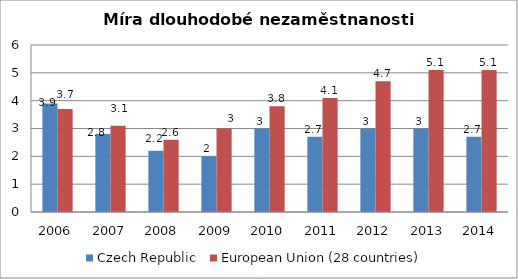
| Category | Czech Republic | European Union (28 countries) |
|---|---|---|
| 2006 | 3.9 | 3.7 |
| 2007 | 2.8 | 3.1 |
| 2008 | 2.2 | 2.6 |
| 2009 | 2 | 3 |
| 2010 | 3 | 3.8 |
| 2011 | 2.7 | 4.1 |
| 2012 | 3 | 4.7 |
| 2013 | 3 | 5.1 |
| 2014 | 2.7 | 5.1 |